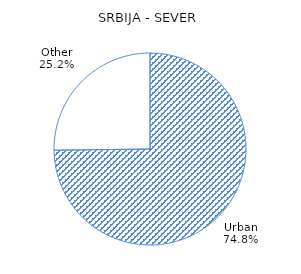
| Category | Series 0 |
|---|---|
| Urban | 74.8 |
| Other | 25.2 |